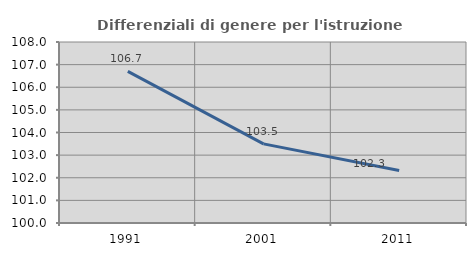
| Category | Differenziali di genere per l'istruzione superiore |
|---|---|
| 1991.0 | 106.698 |
| 2001.0 | 103.498 |
| 2011.0 | 102.317 |